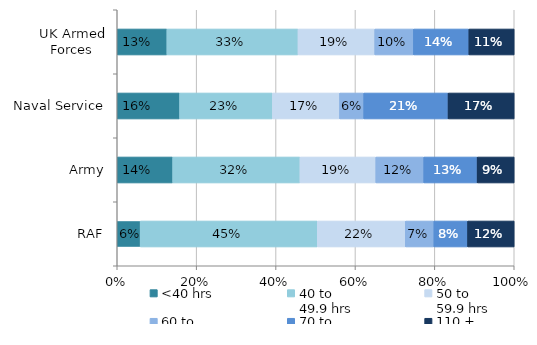
| Category | <40 hrs | 40 to 
49.9 hrs | 50 to 
59.9 hrs | 60 to 
69.9 hrs | 70 to 
109.9 hrs | 110 + 
hrs |
|---|---|---|---|---|---|---|
| UK Armed Forces | 0.125 | 0.33 | 0.193 | 0.097 | 0.14 | 0.114 |
| Naval Service | 0.157 | 0.234 | 0.169 | 0.061 | 0.212 | 0.167 |
| Army | 0.14 | 0.321 | 0.191 | 0.121 | 0.134 | 0.093 |
| RAF | 0.058 | 0.446 | 0.222 | 0.072 | 0.085 | 0.117 |